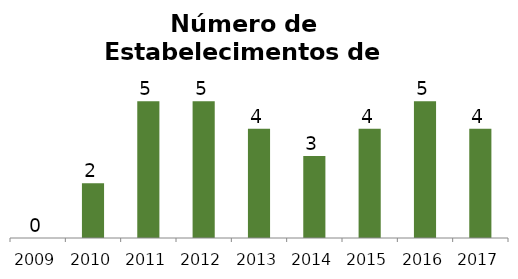
| Category | Eventos |
|---|---|
| 2009.0 | 0 |
| 2010.0 | 2 |
| 2011.0 | 5 |
| 2012.0 | 5 |
| 2013.0 | 4 |
| 2014.0 | 3 |
| 2015.0 | 4 |
| 2016.0 | 5 |
| 2017.0 | 4 |